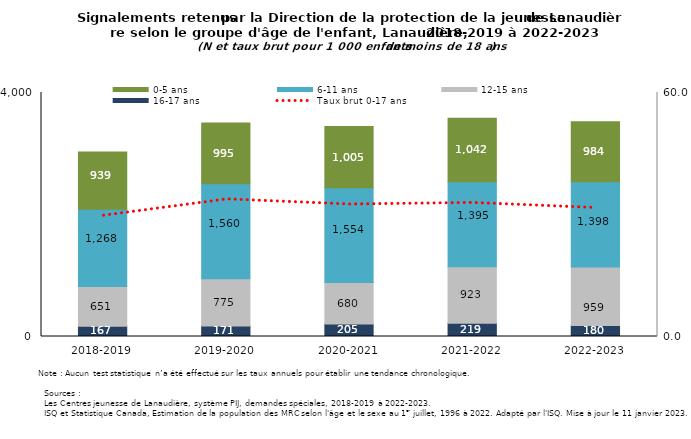
| Category | 16-17 ans | 12-15 ans | 6-11 ans | 0-5 ans |
|---|---|---|---|---|
| 2018-2019 | 167 | 651 | 1268 | 939 |
| 2019-2020 | 171 | 775 | 1560 | 995 |
| 2020-2021 | 205 | 680 | 1554 | 1005 |
| 2021-2022 | 219 | 923 | 1395 | 1042 |
| 2022-2023 | 180 | 959 | 1398 | 984 |